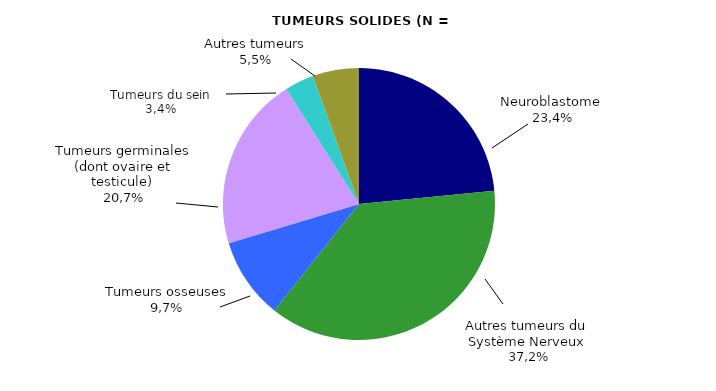
| Category | Series 0 | Series 1 |
|---|---|---|
| Neuroblastome  | 34 | 0.234 |
| Autres tumeurs du  Système Nerveux  | 54 | 0.372 |
| Tumeurs osseuses  | 14 | 0.097 |
| Tumeurs germinales (dont ovaire et testicule)  | 30 | 0.207 |
| Sein | 5 | 0.034 |
| Autres tumeurs | 8 | 0.055 |